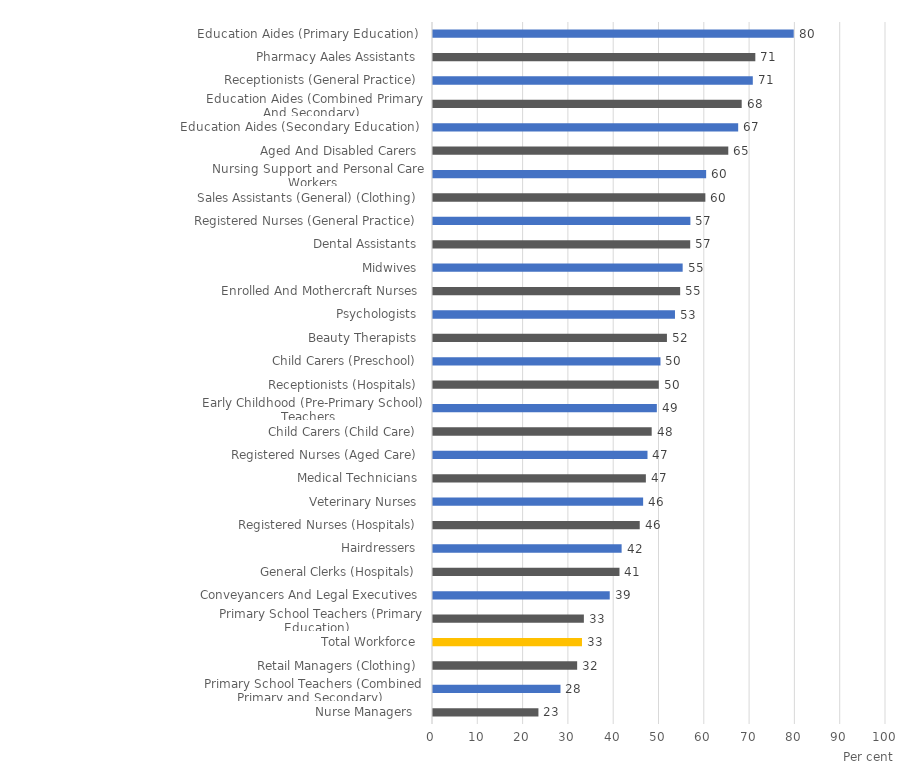
| Category |  % Employed Part time  |
|---|---|
|  Nurse Managers   | 23.273 |
|  Primary School Teachers (Combined Primary and Secondary)  | 28.143 |
|  Retail Managers (Clothing)  | 31.823 |
|  Total Workforce  | 32.886 |
|  Primary School Teachers (Primary Education)  | 33.307 |
|  Conveyancers And Legal Executives  | 39.015 |
|   General Clerks (Hospitals)  | 41.167 |
|  Hairdressers  | 41.639 |
|  Registered Nurses (Hospitals)  | 45.638 |
|  Veterinary Nurses  | 46.385 |
|  Medical Technicians  | 46.991 |
|  Registered Nurses (Aged Care)  | 47.349 |
|   Child Carers (Child Care)  | 48.275 |
|  Early Childhood (Pre-Primary School) Teachers  | 49.413 |
|  Receptionists (Hospitals)  | 49.845 |
|  Child Carers (Preschool)  | 50.214 |
|  Beauty Therapists  | 51.641 |
|  Psychologists  | 53.417 |
|  Enrolled And Mothercraft Nurses  | 54.56 |
|  Midwives  | 55.114 |
|  Dental Assistants  | 56.778 |
|  Registered Nurses (General Practice)  | 56.818 |
|  Sales Assistants (General) (Clothing)  | 60.125 |
|  Nursing Support and Personal Care Workers  | 60.298 |
|  Aged And Disabled Carers  | 65.184 |
|  Education Aides (Secondary Education)  | 67.367 |
|  Education Aides (Combined Primary And Secondary)  | 68.144 |
|  Receptionists (General Practice)  | 70.597 |
|  Pharmacy Aales Assistants  | 71.152 |
|  Education Aides (Primary Education)  | 79.63 |